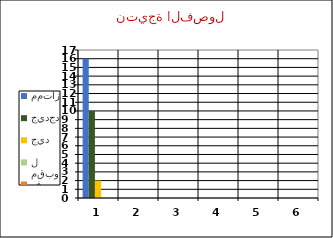
| Category | ممتاز | جيدجدا | جيد | مقبول | ضعيف |
|---|---|---|---|---|---|
| 0 | 16 | 10 | 2 | 0 | 0 |
| 1 | 0 | 0 | 0 | 0 | 0 |
| 2 | 0 | 0 | 0 | 0 | 0 |
| 3 | 0 | 0 | 0 | 0 | 0 |
| 4 | 0 | 0 | 0 | 0 | 0 |
| 5 | 0 | 0 | 0 | 0 | 0 |